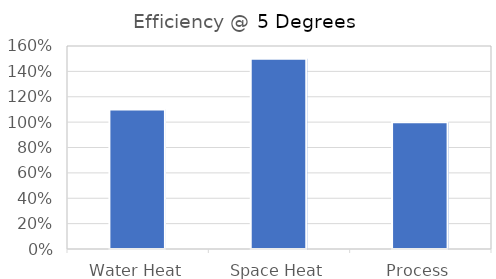
| Category | Series 0 |
|---|---|
| Water Heat | 1.1 |
| Space Heat | 1.5 |
| Process | 1 |